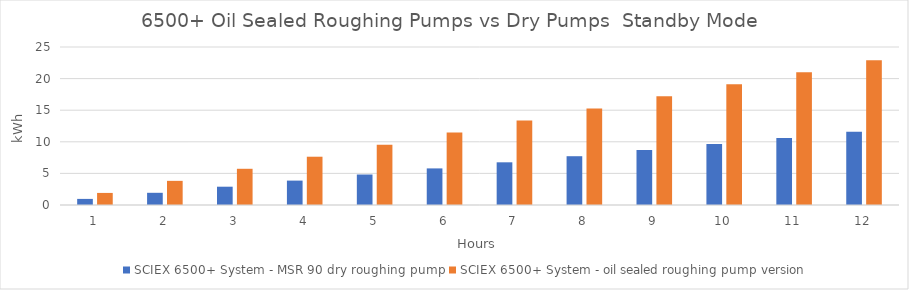
| Category | SCIEX 6500+ System - MSR 90 dry roughing pump | SCIEX 6500+ System - oil sealed roughing pump version  |
|---|---|---|
| 0 | 0.965 | 1.91 |
| 1 | 1.93 | 3.82 |
| 2 | 2.895 | 5.73 |
| 3 | 3.86 | 7.64 |
| 4 | 4.825 | 9.55 |
| 5 | 5.79 | 11.46 |
| 6 | 6.755 | 13.37 |
| 7 | 7.72 | 15.28 |
| 8 | 8.685 | 17.19 |
| 9 | 9.65 | 19.1 |
| 10 | 10.615 | 21.01 |
| 11 | 11.58 | 22.92 |